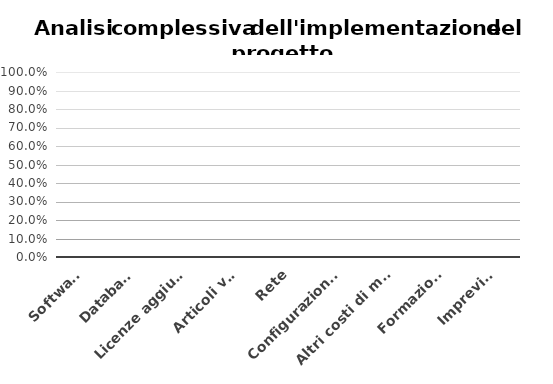
| Category | Series 0 |
|---|---|
| Software | 0 |
| Database | 0 |
| Licenze aggiuntive | 0 |
| Articoli vari | 0 |
| Rete | 0 |
| Configurazione sistemi | 0 |
| Altri costi di manodopera | 0 |
| Formazione | 0 |
| Imprevisti | 0 |